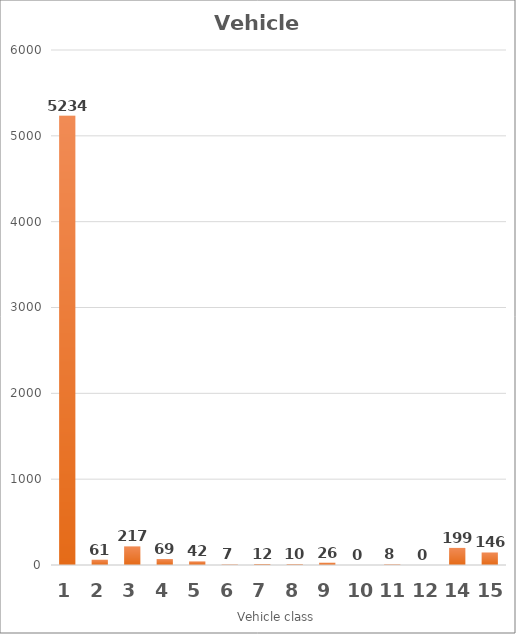
| Category | Series 0 |
|---|---|
| 1.0 | 5234 |
| 2.0 | 61 |
| 3.0 | 217 |
| 4.0 | 69 |
| 5.0 | 42 |
| 6.0 | 7 |
| 7.0 | 12 |
| 8.0 | 10 |
| 9.0 | 26 |
| 10.0 | 0 |
| 11.0 | 8 |
| 12.0 | 0 |
| 14.0 | 199 |
| 15.0 | 146 |